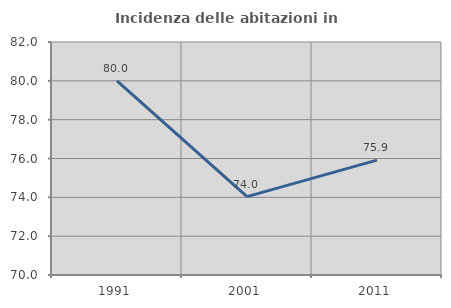
| Category | Incidenza delle abitazioni in proprietà  |
|---|---|
| 1991.0 | 80 |
| 2001.0 | 74.038 |
| 2011.0 | 75.918 |